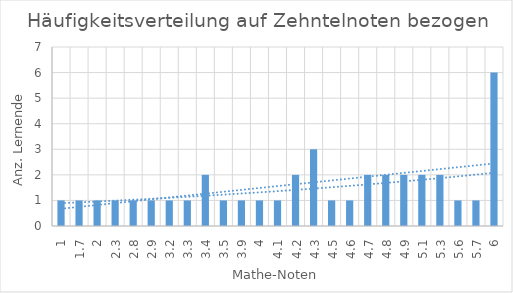
| Category | Series 0 |
|---|---|
| 1.0 | 1 |
| 1.7 | 1 |
| 2.0 | 1 |
| 2.3 | 1 |
| 2.8 | 1 |
| 2.9 | 1 |
| 3.2 | 1 |
| 3.3 | 1 |
| 3.4 | 2 |
| 3.5 | 1 |
| 3.9 | 1 |
| 4.0 | 1 |
| 4.1 | 1 |
| 4.2 | 2 |
| 4.3 | 3 |
| 4.5 | 1 |
| 4.6 | 1 |
| 4.7 | 2 |
| 4.8 | 2 |
| 4.9 | 2 |
| 5.1 | 2 |
| 5.3 | 2 |
| 5.6 | 1 |
| 5.7 | 1 |
| 6.0 | 6 |